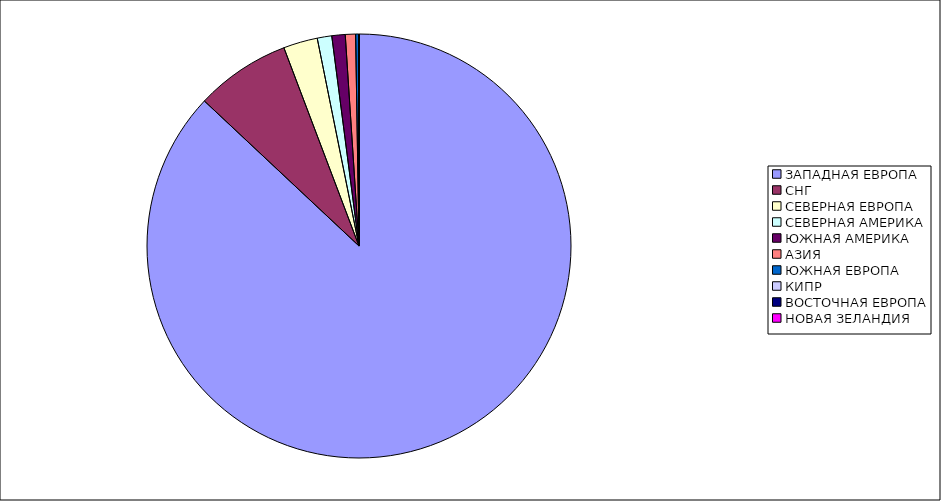
| Category | Оборот |
|---|---|
| ЗАПАДНАЯ ЕВРОПА | 0.87 |
| СНГ | 0.072 |
| СЕВЕРНАЯ ЕВРОПА | 0.026 |
| СЕВЕРНАЯ АМЕРИКА | 0.011 |
| ЮЖНАЯ АМЕРИКА | 0.01 |
| АЗИЯ | 0.008 |
| ЮЖНАЯ ЕВРОПА | 0.002 |
| КИПР | 0 |
| ВОСТОЧНАЯ ЕВРОПА | 0 |
| НОВАЯ ЗЕЛАНДИЯ | 0 |